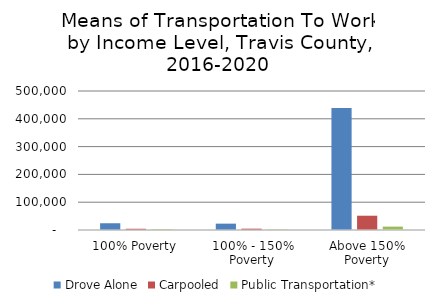
| Category | Drove Alone | Carpooled | Public Transportation* |
|---|---|---|---|
| 100% Poverty | 24305.45 | 4421.829 | 2812.14 |
| 100% - 150% Poverty | 22847.123 | 4785.267 | 1604.574 |
| Above 150% Poverty | 438956.427 | 51365.904 | 12125.286 |